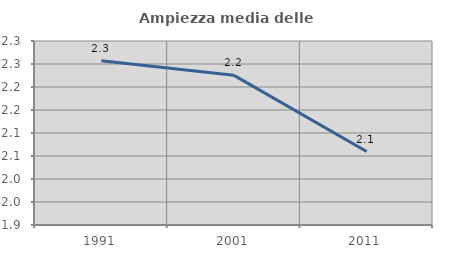
| Category | Ampiezza media delle famiglie |
|---|---|
| 1991.0 | 2.257 |
| 2001.0 | 2.225 |
| 2011.0 | 2.06 |